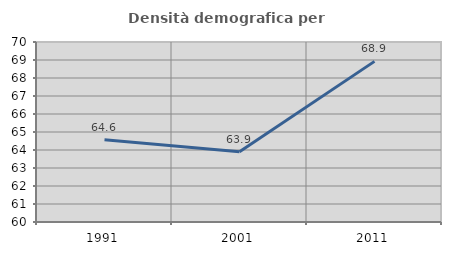
| Category | Densità demografica |
|---|---|
| 1991.0 | 64.571 |
| 2001.0 | 63.907 |
| 2011.0 | 68.923 |